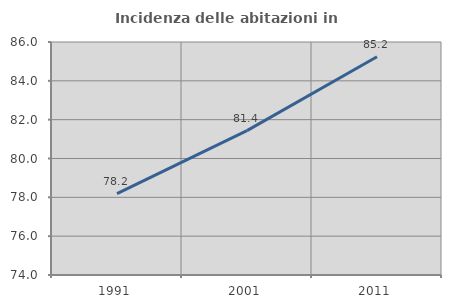
| Category | Incidenza delle abitazioni in proprietà  |
|---|---|
| 1991.0 | 78.193 |
| 2001.0 | 81.437 |
| 2011.0 | 85.241 |